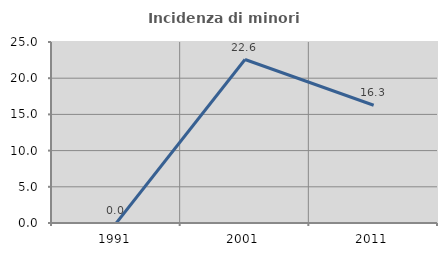
| Category | Incidenza di minori stranieri |
|---|---|
| 1991.0 | 0 |
| 2001.0 | 22.581 |
| 2011.0 | 16.265 |